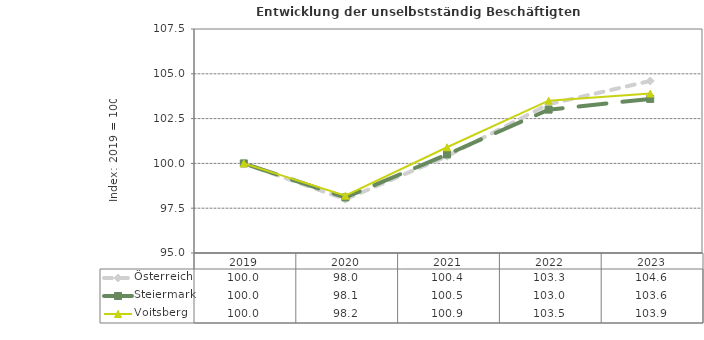
| Category | Österreich | Steiermark | Voitsberg |
|---|---|---|---|
| 2023.0 | 104.6 | 103.6 | 103.9 |
| 2022.0 | 103.3 | 103 | 103.5 |
| 2021.0 | 100.4 | 100.5 | 100.9 |
| 2020.0 | 98 | 98.1 | 98.2 |
| 2019.0 | 100 | 100 | 100 |